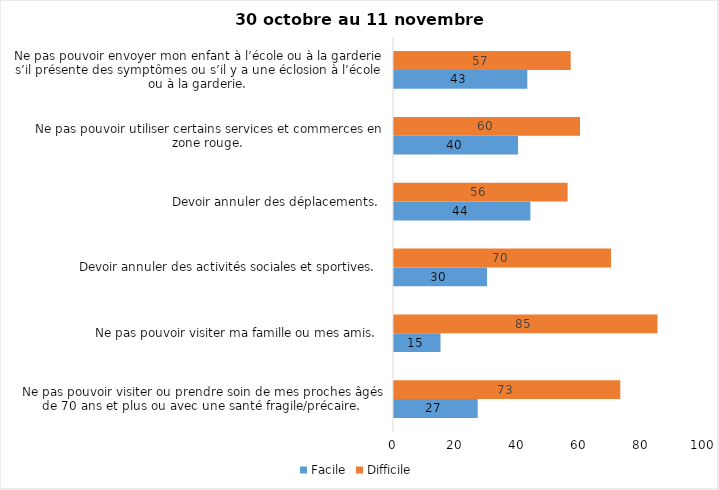
| Category | Facile | Difficile |
|---|---|---|
| Ne pas pouvoir visiter ou prendre soin de mes proches âgés de 70 ans et plus ou avec une santé fragile/précaire.  | 27 | 73 |
| Ne pas pouvoir visiter ma famille ou mes amis.  | 15 | 85 |
| Devoir annuler des activités sociales et sportives.  | 30 | 70 |
| Devoir annuler des déplacements.  | 44 | 56 |
| Ne pas pouvoir utiliser certains services et commerces en zone rouge.  | 40 | 60 |
| Ne pas pouvoir envoyer mon enfant à l’école ou à la garderie s’il présente des symptômes ou s’il y a une éclosion à l’école ou à la garderie.  | 43 | 57 |